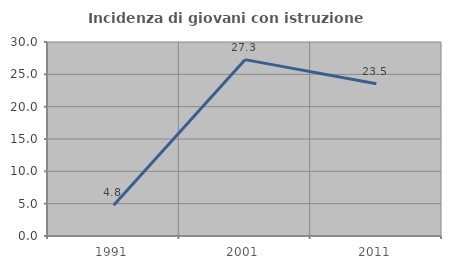
| Category | Incidenza di giovani con istruzione universitaria |
|---|---|
| 1991.0 | 4.762 |
| 2001.0 | 27.273 |
| 2011.0 | 23.529 |